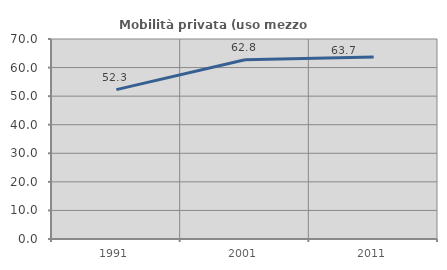
| Category | Mobilità privata (uso mezzo privato) |
|---|---|
| 1991.0 | 52.272 |
| 2001.0 | 62.761 |
| 2011.0 | 63.668 |